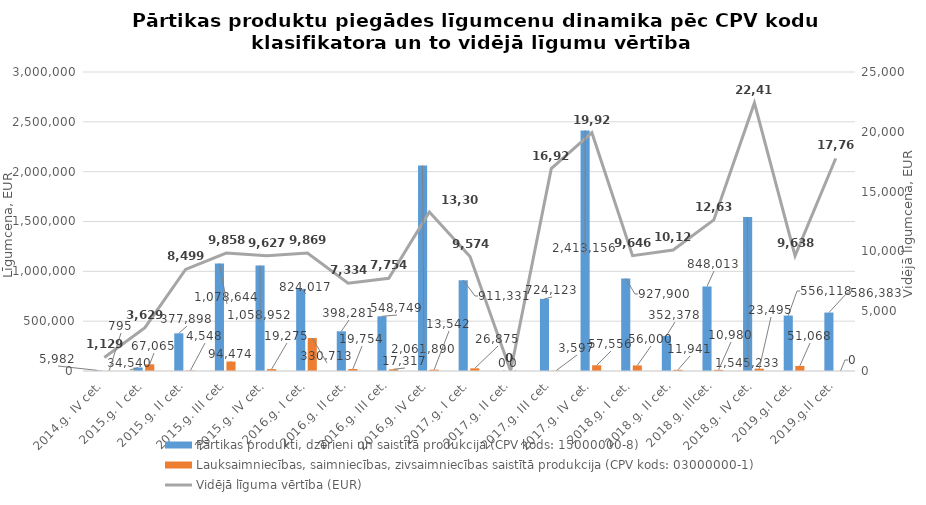
| Category | Pārtikas produkti, dzērieni un saistītā produkcija (CPV kods: 15000000-8) | Lauksaimniecības, saimniecības, zivsaimniecības saistītā produkcija (CPV kods: 03000000-1) |
|---|---|---|
| 2014.g. IV cet. | 5982 | 795 |
| 2015.g. I cet. | 34540 | 67065 |
| 2015.g. II cet. | 377898 | 4548 |
| 2015.g. III cet. | 1078644 | 94474 |
| 2015.g. IV cet. | 1058952 | 19275 |
| 2016.g. I cet. | 824017 | 330713 |
| 2016.g. II cet. | 398281 | 19754 |
| 2016.g. III cet. | 548749.01 | 17317 |
| 2016.g. IV cet. | 2061890 | 13542 |
| 2017.g. I cet. | 911330.81 | 26874.91 |
| 2017.g. II cet. | 0 | 0 |
| 2017.g. III cet. | 724123.07 | 3596.6 |
| 2017.g. IV cet. | 2413156 | 57556 |
| 2018.g. I cet. | 927900 | 56000 |
| 2018.g. II cet. | 352378 | 11941 |
| 2018.g. IIIcet. | 848013 | 10980 |
| 2018.g. IV cet. | 1545233 | 23495 |
| 2019.g.I cet. | 556118 | 51068 |
| 2019.g.II cet. | 586383 | 0 |